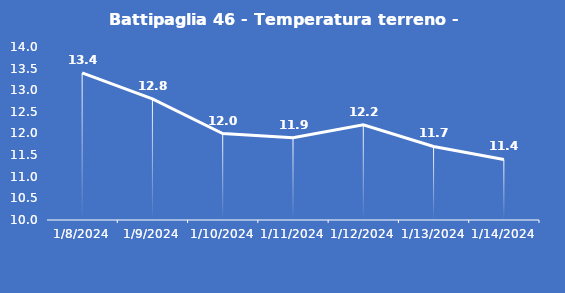
| Category | Battipaglia 46 - Temperatura terreno - Max (°C) |
|---|---|
| 1/8/24 | 13.4 |
| 1/9/24 | 12.8 |
| 1/10/24 | 12 |
| 1/11/24 | 11.9 |
| 1/12/24 | 12.2 |
| 1/13/24 | 11.7 |
| 1/14/24 | 11.4 |